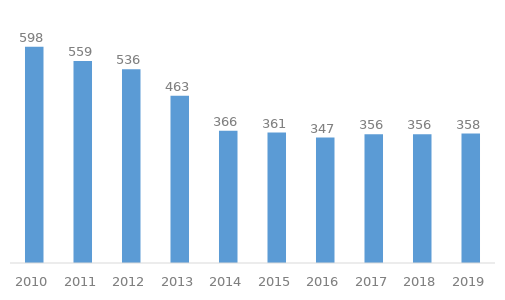
| Category | Series 0 |
|---|---|
| 2010.0 | 598 |
| 2011.0 | 559 |
| 2012.0 | 536 |
| 2013.0 | 463 |
| 2014.0 | 366 |
| 2015.0 | 361 |
| 2016.0 | 347 |
| 2017.0 | 356 |
| 2018.0 | 356 |
| 2019.0 | 358 |